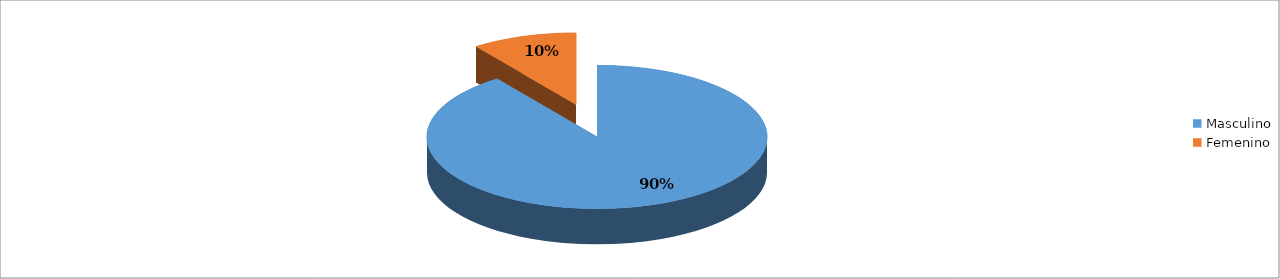
| Category | Series 0 |
|---|---|
| Masculino | 0.9 |
| Femenino | 0.1 |